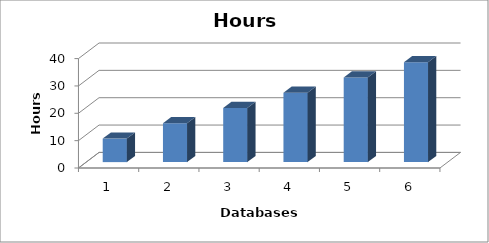
| Category | Hours Saved |
|---|---|
| 0 | 8.593 |
| 1 | 14.186 |
| 2 | 19.779 |
| 3 | 25.371 |
| 4 | 30.964 |
| 5 | 36.557 |